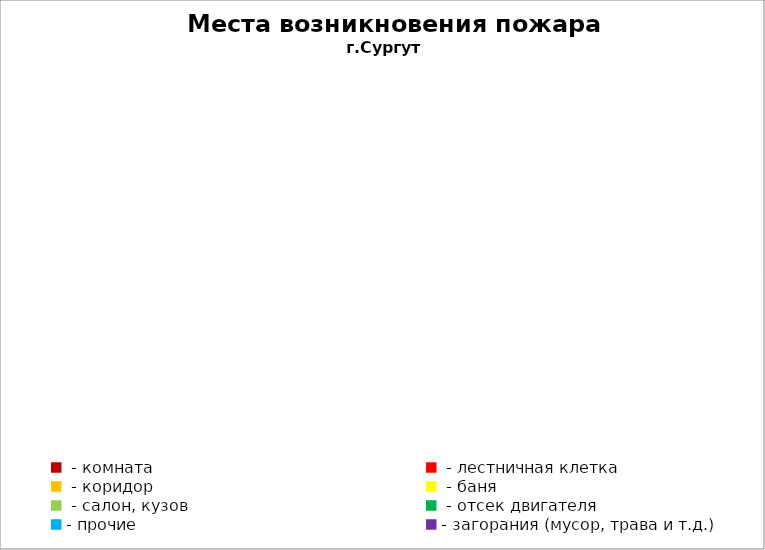
| Category | Места возникновения пожара |
|---|---|
|  - комната | 24 |
|  - лестничная клетка | 10 |
|  - коридор | 3 |
|  - баня | 10 |
|  - салон, кузов | 4 |
|  - отсек двигателя | 9 |
| - прочие | 26 |
| - загорания (мусор, трава и т.д.)  | 38 |